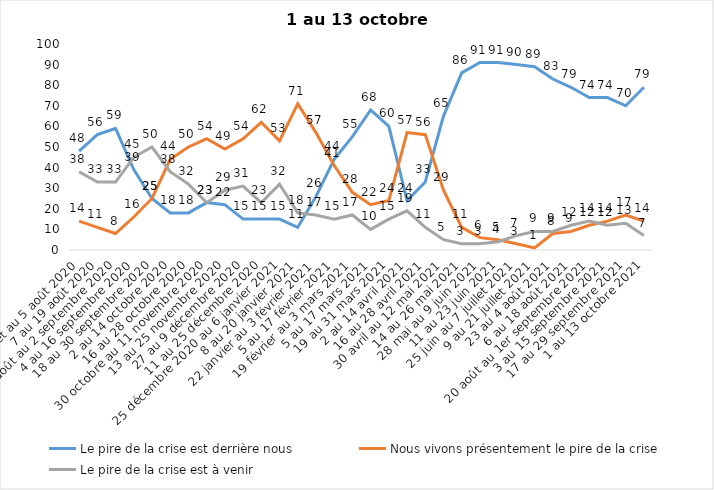
| Category | Le pire de la crise est derrière nous | Nous vivons présentement le pire de la crise | Le pire de la crise est à venir |
|---|---|---|---|
| 24 juillet au 5 août 2020 | 48 | 14 | 38 |
| 7 au 19 août 2020 | 56 | 11 | 33 |
| 21 août au 2 septembre 2020 | 59 | 8 | 33 |
| 4 au 16 septembre 2020 | 39 | 16 | 45 |
| 18 au 30 septembre 2020 | 25 | 25 | 50 |
| 2 au 14 octobre 2020 | 18 | 44 | 38 |
| 16 au 28 octobre 2020 | 18 | 50 | 32 |
| 30 octobre au 11 novembre 2020 | 23 | 54 | 23 |
| 13 au 25 novembre 2020 | 22 | 49 | 29 |
| 27 au 9 décembre 2020 | 15 | 54 | 31 |
| 11 au 25 décembre 2020 | 15 | 62 | 23 |
| 25 décembre 2020 au 6 janvier 2021 | 15 | 53 | 32 |
| 8 au 20 janvier 2021 | 11 | 71 | 18 |
| 22 janvier au 3 février 2021 | 26 | 57 | 17 |
| 5 au 17 février 2021 | 44 | 41 | 15 |
| 19 février au 3 mars 2021 | 55 | 28 | 17 |
| 5 au 17 mars 2021 | 68 | 22 | 10 |
| 19 au 31 mars 2021 | 60 | 24 | 15 |
| 2 au 14 avril 2021 | 24 | 57 | 19 |
| 16 au 28 avril 2021 | 33 | 56 | 11 |
| 30 avril au 12 mai 2021 | 65 | 29 | 5 |
| 14 au 26 mai 2021 | 86 | 11 | 3 |
| 28 mai au 9 juin 2021 | 91 | 6 | 3 |
| 11 au 23 juin 2021 | 91 | 5 | 4 |
| 25 juin au 7 juillet 2021 | 90 | 3 | 7 |
| 9 au 21 juillet 2021 | 89 | 1 | 9 |
| 23 au 4 août 2021 | 83 | 8 | 9 |
| 6 au 18 août 2021 | 79 | 9 | 12 |
| 20 août au 1er septembre 2021 | 74 | 12 | 14 |
| 3 au 15 septembre 2021 | 74 | 14 | 12 |
| 17 au 29 septembre 2021 | 70 | 17 | 13 |
| 1 au 13 octobre 2021 | 79 | 14 | 7 |